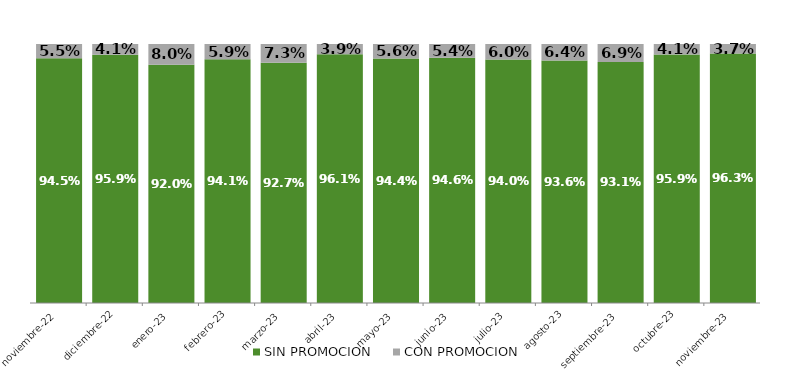
| Category | SIN PROMOCION   | CON PROMOCION   |
|---|---|---|
| 2022-11-01 | 0.945 | 0.055 |
| 2022-12-01 | 0.959 | 0.041 |
| 2023-01-01 | 0.92 | 0.08 |
| 2023-02-01 | 0.941 | 0.059 |
| 2023-03-01 | 0.927 | 0.073 |
| 2023-04-01 | 0.961 | 0.039 |
| 2023-05-01 | 0.944 | 0.056 |
| 2023-06-01 | 0.946 | 0.054 |
| 2023-07-01 | 0.94 | 0.06 |
| 2023-08-01 | 0.936 | 0.064 |
| 2023-09-01 | 0.931 | 0.069 |
| 2023-10-01 | 0.959 | 0.041 |
| 2023-11-01 | 0.963 | 0.037 |